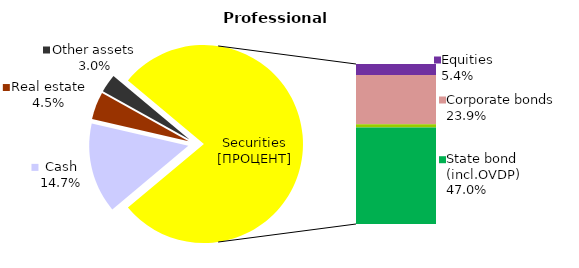
| Category | Professional |
|---|---|
| Cash | 22.993 |
| Bank metals | 0 |
| Real estate | 7.006 |
| Other assets | 4.703 |
| Equities | 8.43 |
| Corporate bonds | 37.472 |
| Municipal bonds | 2.38 |
| State bond (incl.OVDP) | 73.529 |